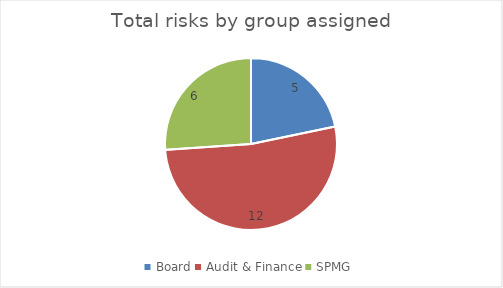
| Category | Oct-20 |
|---|---|
| Board | 5 |
| Audit & Finance | 12 |
| SPMG | 6 |